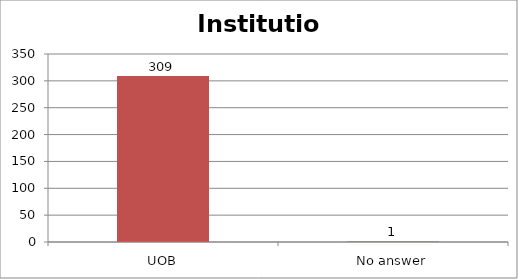
| Category | Institution |
|---|---|
| UOB | 309 |
| No answer | 1 |